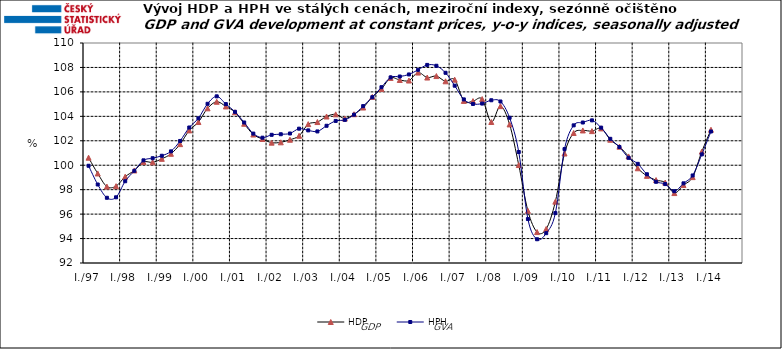
| Category | HDP

 | HPH

 |
|---|---|---|
| I./97 | 100.616 | 99.955 |
|  | 99.326 | 98.423 |
|  | 98.252 | 97.336 |
|  | 98.285 | 97.375 |
| I./98 | 99.06 | 98.689 |
|  | 99.571 | 99.544 |
|  | 100.264 | 100.399 |
|  | 100.237 | 100.572 |
| I./99 | 100.523 | 100.774 |
|  | 100.935 | 101.133 |
|  | 101.726 | 101.985 |
|  | 102.85 | 103.087 |
| I./00 | 103.534 | 103.84 |
|  | 104.655 | 105.026 |
|  | 105.193 | 105.636 |
|  | 104.809 | 105 |
| I./01 | 104.333 | 104.368 |
|  | 103.393 | 103.498 |
|  | 102.512 | 102.587 |
|  | 102.145 | 102.253 |
| I./02 | 101.846 | 102.488 |
|  | 101.874 | 102.535 |
|  | 102.085 | 102.597 |
|  | 102.408 | 102.989 |
| I./03 | 103.362 | 102.85 |
|  | 103.531 | 102.765 |
|  | 103.987 | 103.228 |
|  | 104.162 | 103.624 |
| I./04 | 103.819 | 103.711 |
|  | 104.172 | 104.134 |
|  | 104.72 | 104.837 |
|  | 105.592 | 105.566 |
| I./05 | 106.247 | 106.384 |
|  | 107.143 | 107.186 |
|  | 106.975 | 107.258 |
|  | 106.928 | 107.427 |
| I./06 | 107.58 | 107.805 |
|  | 107.174 | 108.207 |
|  | 107.295 | 108.137 |
|  | 106.866 | 107.563 |
| I./07 | 107.001 | 106.508 |
|  | 105.264 | 105.385 |
|  | 105.246 | 105.012 |
|  | 105.413 | 105.044 |
| I./08 | 103.537 | 105.315 |
|  | 104.833 | 105.214 |
|  | 103.338 | 103.881 |
|  | 100.015 | 101.081 |
| I./09 | 96.269 | 95.595 |
|  | 94.531 | 93.944 |
|  | 94.786 | 94.441 |
|  | 97.02 | 96.083 |
| I./10 | 100.959 | 101.321 |
|  | 102.638 | 103.262 |
|  | 102.845 | 103.495 |
|  | 102.79 | 103.672 |
| I./11 | 103.012 | 103.074 |
|  | 102.088 | 102.16 |
|  | 101.516 | 101.488 |
|  | 100.719 | 100.608 |
| I./12 | 99.751 | 100.113 |
|  | 99.129 | 99.262 |
|  | 98.786 | 98.643 |
|  | 98.578 | 98.458 |
| I./13 | 97.722 | 97.875 |
|  | 98.379 | 98.517 |
|  | 99.027 | 99.163 |
|  | 101.115 | 100.888 |
| I./14 | 102.902 | 102.758 |